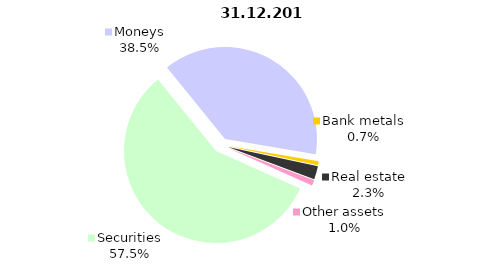
| Category | Total |
|---|---|
| Securities | 783.998 |
| Moneys | 525.169 |
| Bank metals | 9.809 |
| Real estate | 31.721 |
| Other assets | 13.441 |